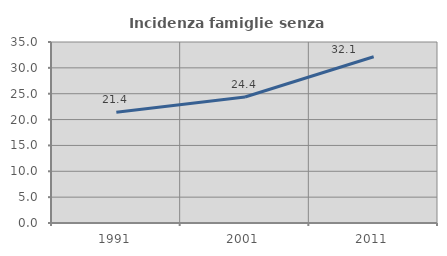
| Category | Incidenza famiglie senza nuclei |
|---|---|
| 1991.0 | 21.429 |
| 2001.0 | 24.359 |
| 2011.0 | 32.143 |